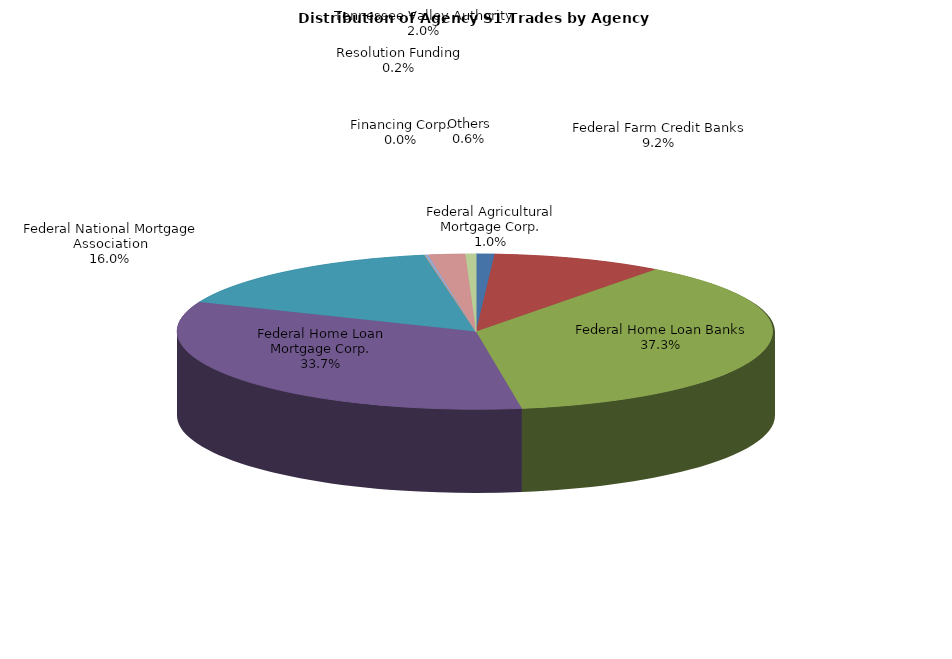
| Category | Series 0 |
|---|---|
| Federal Agricultural Mortgage Corp. | 29.725 |
| Federal Farm Credit Banks | 278.163 |
| Federal Home Loan Banks | 1123.857 |
| Federal Home Loan Mortgage Corp. | 1013.319 |
| Federal National Mortgage Association | 482.797 |
| Financing Corp. | 0 |
| Resolution Funding | 5.546 |
| Tennessee Valley Authority | 59.972 |
| Others | 17.131 |